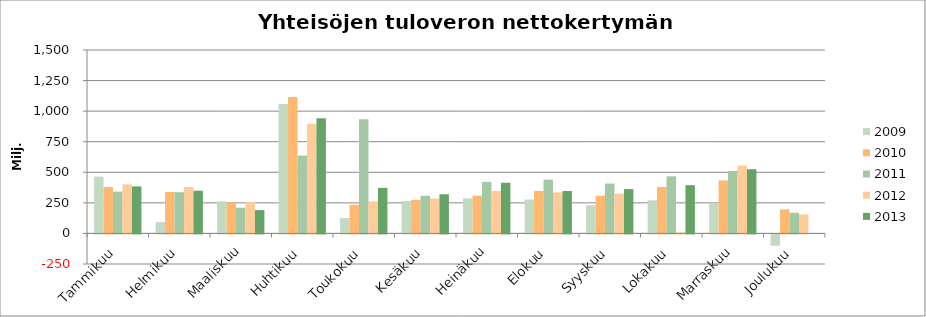
| Category | 2009 | 2010 | 2011 | 2012 | 2013 |
|---|---|---|---|---|---|
| Tammikuu | 464.899 | 378.86 | 341.987 | 401.627 | 384.485 |
| Helmikuu | 92.021 | 339.045 | 337.078 | 379.401 | 349.199 |
| Maaliskuu | 261.783 | 253.057 | 210.203 | 256.28 | 190.945 |
| Huhtikuu | 1059.201 | 1115.624 | 636.437 | 897.203 | 940.935 |
| Toukokuu | 126.163 | 234.756 | 933.434 | 262.244 | 372.901 |
| Kesäkuu | 265.105 | 274.88 | 307.856 | 285.13 | 320.319 |
| Heinäkuu | 286.978 | 308.391 | 421.522 | 347.389 | 414.27 |
| Elokuu | 277.363 | 347.548 | 439.399 | 335.795 | 347.137 |
| Syyskuu | 230.468 | 308.333 | 407.65 | 326.578 | 362.569 |
| Lokakuu | 270.56 | 380.508 | 466.894 | 9.04 | 394.905 |
| Marraskuu | 249.968 | 432.891 | 511.438 | 554.296 | 524.993 |
| Joulukuu | -92.536 | 196.924 | 169.141 | 155.44 | 0 |